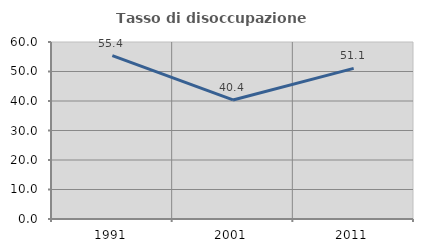
| Category | Tasso di disoccupazione giovanile  |
|---|---|
| 1991.0 | 55.395 |
| 2001.0 | 40.361 |
| 2011.0 | 51.059 |